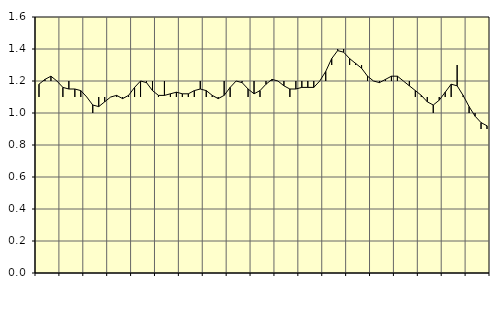
| Category | Piggar | Jordbruk, skogsbruk o fiske, SNI 01-03 |
|---|---|---|
| nan | 1.1 | 1.18 |
| 1.0 | 1.2 | 1.21 |
| 1.0 | 1.2 | 1.23 |
| 1.0 | 1.2 | 1.2 |
| nan | 1.1 | 1.16 |
| 2.0 | 1.2 | 1.15 |
| 2.0 | 1.1 | 1.15 |
| 2.0 | 1.1 | 1.14 |
| nan | 1.1 | 1.1 |
| 3.0 | 1 | 1.05 |
| 3.0 | 1.1 | 1.04 |
| 3.0 | 1.1 | 1.07 |
| nan | 1.1 | 1.1 |
| 4.0 | 1.1 | 1.11 |
| 4.0 | 1.1 | 1.09 |
| 4.0 | 1.1 | 1.11 |
| nan | 1.1 | 1.16 |
| 5.0 | 1.1 | 1.2 |
| 5.0 | 1.2 | 1.19 |
| 5.0 | 1.2 | 1.14 |
| nan | 1.1 | 1.11 |
| 6.0 | 1.2 | 1.11 |
| 6.0 | 1.1 | 1.12 |
| 6.0 | 1.1 | 1.13 |
| nan | 1.1 | 1.12 |
| 7.0 | 1.1 | 1.12 |
| 7.0 | 1.1 | 1.14 |
| 7.0 | 1.2 | 1.15 |
| nan | 1.1 | 1.14 |
| 8.0 | 1.1 | 1.11 |
| 8.0 | 1.1 | 1.09 |
| 8.0 | 1.2 | 1.11 |
| nan | 1.1 | 1.16 |
| 9.0 | 1.2 | 1.2 |
| 9.0 | 1.2 | 1.19 |
| 9.0 | 1.1 | 1.15 |
| nan | 1.2 | 1.12 |
| 10.0 | 1.1 | 1.14 |
| 10.0 | 1.2 | 1.18 |
| 10.0 | 1.2 | 1.21 |
| nan | 1.2 | 1.2 |
| 11.0 | 1.2 | 1.17 |
| 11.0 | 1.1 | 1.15 |
| 11.0 | 1.2 | 1.15 |
| nan | 1.2 | 1.16 |
| 12.0 | 1.2 | 1.16 |
| 12.0 | 1.2 | 1.16 |
| 12.0 | 1.2 | 1.2 |
| nan | 1.2 | 1.26 |
| 13.0 | 1.3 | 1.34 |
| 13.0 | 1.4 | 1.39 |
| 13.0 | 1.4 | 1.38 |
| nan | 1.3 | 1.34 |
| 14.0 | 1.3 | 1.31 |
| 14.0 | 1.3 | 1.28 |
| 14.0 | 1.2 | 1.23 |
| nan | 1.2 | 1.2 |
| 15.0 | 1.2 | 1.19 |
| 15.0 | 1.2 | 1.21 |
| 15.0 | 1.2 | 1.23 |
| nan | 1.2 | 1.23 |
| 16.0 | 1.2 | 1.2 |
| 16.0 | 1.2 | 1.17 |
| 16.0 | 1.1 | 1.14 |
| nan | 1.1 | 1.11 |
| 17.0 | 1.1 | 1.07 |
| 17.0 | 1 | 1.05 |
| 17.0 | 1.1 | 1.08 |
| nan | 1.1 | 1.13 |
| 18.0 | 1.1 | 1.18 |
| 18.0 | 1.3 | 1.17 |
| 18.0 | 1.1 | 1.11 |
| nan | 1 | 1.04 |
| 19.0 | 1 | 0.98 |
| 19.0 | 0.9 | 0.94 |
| 19.0 | 0.9 | 0.92 |